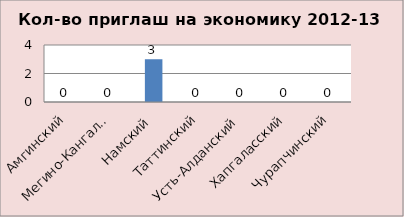
| Category | Series 0 |
|---|---|
| Амгинский | 0 |
| Мегино-Кангаласский | 0 |
| Намский | 3 |
| Таттинский | 0 |
| Усть-Алданский | 0 |
| Хапгаласский | 0 |
| Чурапчинский | 0 |